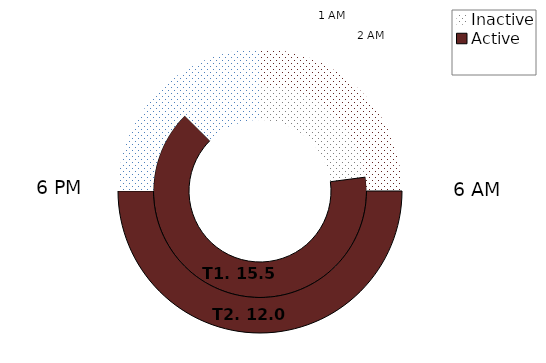
| Category | T1 | T2 | T3 |
|---|---|---|---|
| Inactive | 1900-01-05 12:00:00 | 6 |  |
| Active | 1900-01-15 12:00:00 | 12 |  |
| Inactive | 1900-01-03 | 6 |  |